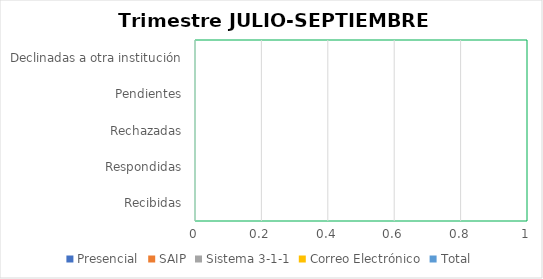
| Category | Presencial | SAIP | Sistema 3-1-1 | Correo Electrónico | Total |
|---|---|---|---|---|---|
| Recibidas | 0 | 0 | 0 | 0 | 0 |
| Respondidas | 0 | 0 | 0 | 0 | 0 |
| Rechazadas | 0 | 0 | 0 | 0 | 0 |
| Pendientes | 0 | 0 | 0 | 0 | 0 |
| Declinadas a otra institución | 0 | 0 | 0 | 0 | 0 |